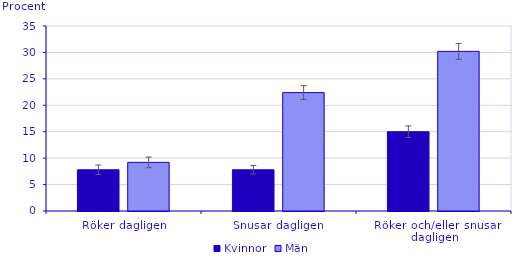
| Category | Kvinnor | Män |
|---|---|---|
| Röker dagligen | 7.8 | 9.2 |
| Snusar dagligen | 7.8 | 22.4 |
| Röker och/eller snusar dagligen | 15 | 30.2 |